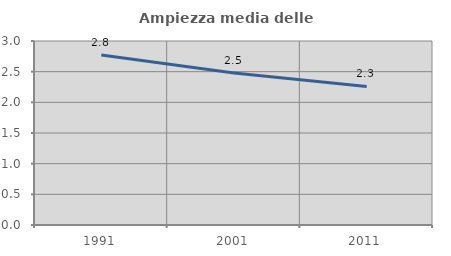
| Category | Ampiezza media delle famiglie |
|---|---|
| 1991.0 | 2.773 |
| 2001.0 | 2.479 |
| 2011.0 | 2.259 |